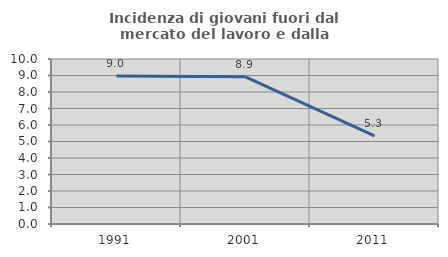
| Category | Incidenza di giovani fuori dal mercato del lavoro e dalla formazione  |
|---|---|
| 1991.0 | 8.969 |
| 2001.0 | 8.917 |
| 2011.0 | 5.344 |